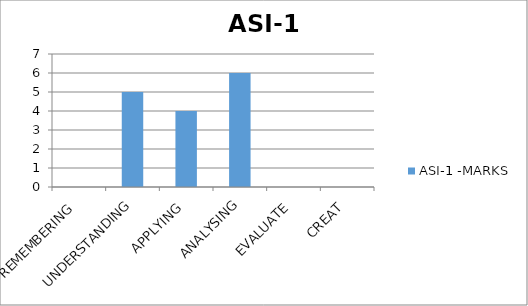
| Category | ASI-1 -MARKS |
|---|---|
| REMEMBERING | 0 |
| UNDERSTANDING | 5 |
| APPLYING | 4 |
| ANALYSING | 6 |
| EVALUATE | 0 |
| CREAT | 0 |